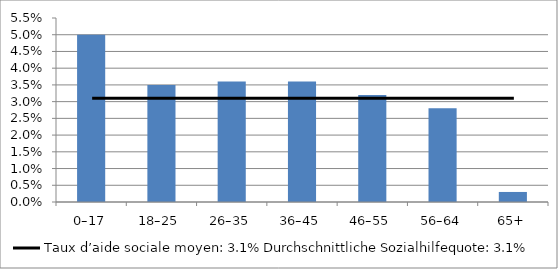
| Category | Series 0 |
|---|---|
|  0–17  | 0.05 |
|  18–25  | 0.035 |
|  26–35  | 0.036 |
|  36–45  | 0.036 |
|  46–55  | 0.032 |
|  56–64  | 0.028 |
|  65+  | 0.003 |